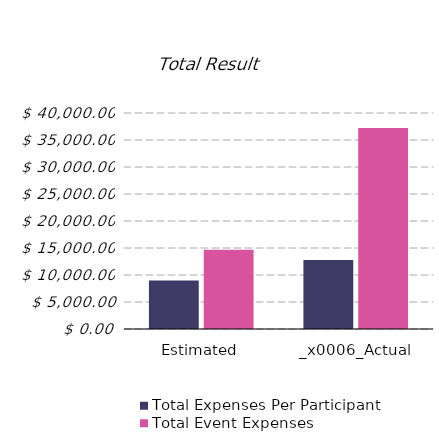
| Category | Total Expenses Per Participant | Total Event Expenses |
|---|---|---|
| 0 | 9000 | 14695 |
| 1 | 12800 | 37200 |